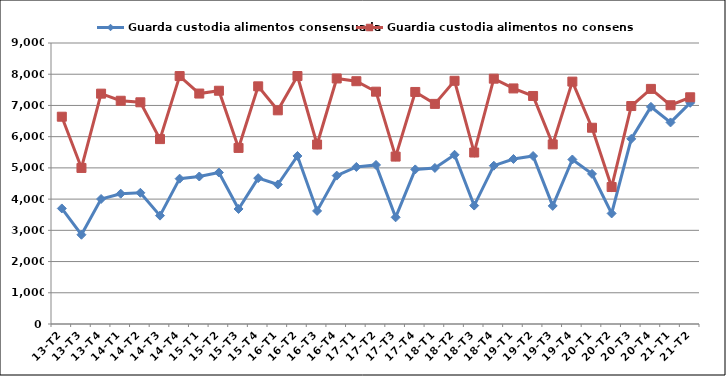
| Category | Guarda custodia alimentos consensuada | Guardia custodia alimentos no consensuada |
|---|---|---|
| 13-T2 | 3701 | 6639 |
| 13-T3 | 2859 | 4998 |
| 13-T4 | 4004 | 7378 |
| 14-T1 | 4173 | 7150 |
| 14-T2 | 4203 | 7101 |
| 14-T3 | 3471 | 5922 |
| 14-T4 | 4655 | 7941 |
| 15-T1 | 4724 | 7381 |
| 15-T2 | 4852 | 7471 |
| 15-T3 | 3684 | 5640 |
| 15-T4 | 4672 | 7612 |
| 16-T1 | 4468 | 6844 |
| 16-T2 | 5382 | 7942 |
| 16-T3 | 3622 | 5748 |
| 16-T4 | 4753 | 7864 |
| 17-T1 | 5030 | 7776 |
| 17-T2 | 5094 | 7441 |
| 17-T3 | 3417 | 5362 |
| 17-T4 | 4951 | 7432 |
| 18-T1 | 4998 | 7050 |
| 18-T2 | 5420 | 7789 |
| 18-T3 | 3793 | 5492 |
| 18-T4 | 5070 | 7857 |
| 19-T1 | 5285 | 7545 |
| 19-T2 | 5380 | 7303 |
| 19-T3 | 3782 | 5753 |
| 19-T4 | 5269 | 7763 |
| 20-T1 | 4809 | 6286 |
| 20-T2 | 3542 | 4387 |
| 20-T3 | 5930 | 6981 |
| 20-T4 | 6955 | 7530 |
| 21-T1 | 6456 | 7006 |
| 21-T2 | 7084 | 7261 |